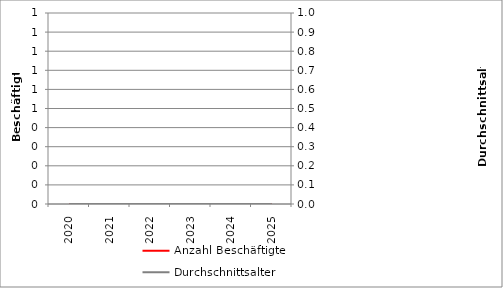
| Category | Anzahl Beschäftigte |
|---|---|
| 2020.0 | 149 |
| 2021.0 | 149 |
| 2022.0 | 147.9 |
| 2023.0 | 148.7 |
| 2024.0 | 148.4 |
| 2025.0 | 149.2 |